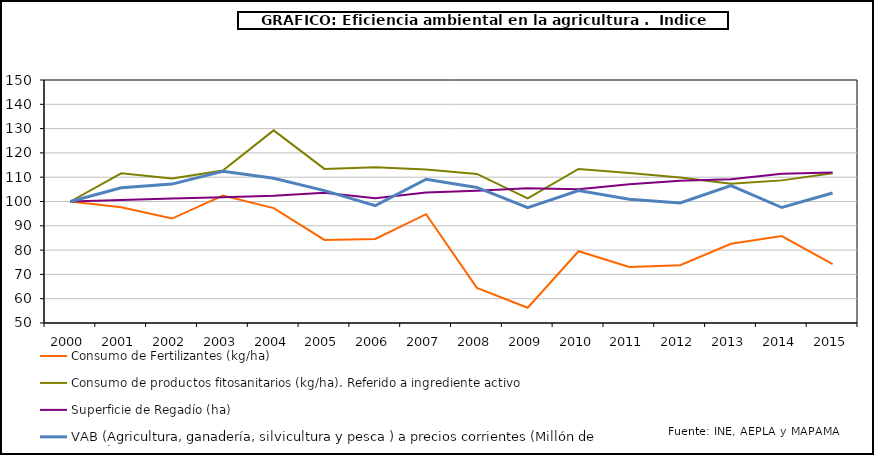
| Category | Consumo de Fertilizantes (kg/ha) | Consumo de productos fitosanitarios (kg/ha). Referido a ingrediente activo | Superficie de Regadío (ha) | VAB (Agricultura, ganadería, silvicultura y pesca ) a precios corrientes (Millón de euros)  |
|---|---|---|---|---|
| 2000.0 | 100 | 100 | 100 | 100 |
| 2001.0 | 97.588 | 111.6 | 100.6 | 105.683 |
| 2002.0 | 92.982 | 109.518 | 101.204 | 107.165 |
| 2003.0 | 102.41 | 112.754 | 101.779 | 112.463 |
| 2004.0 | 97.298 | 129.264 | 102.355 | 109.594 |
| 2005.0 | 84.18 | 113.41 | 103.642 | 104.462 |
| 2006.0 | 84.589 | 114.062 | 101.298 | 98.295 |
| 2007.0 | 94.775 | 113.159 | 103.707 | 109.172 |
| 2008.0 | 64.459 | 111.354 | 104.392 | 105.799 |
| 2009.0 | 56.283 | 101.28 | 105.455 | 97.471 |
| 2010.0 | 79.525 | 113.398 | 105.091 | 104.524 |
| 2011.0 | 73.017 | 111.685 | 107.082 | 100.956 |
| 2012.0 | 73.804 | 109.922 | 108.562 | 99.416 |
| 2013.0 | 82.6 | 107.285 | 109.114 | 106.577 |
| 2014.0 | 85.747 | 108.693 | 111.425 | 97.517 |
| 2015.0 | 74.233 | 111.63 | 111.963 | 103.493 |